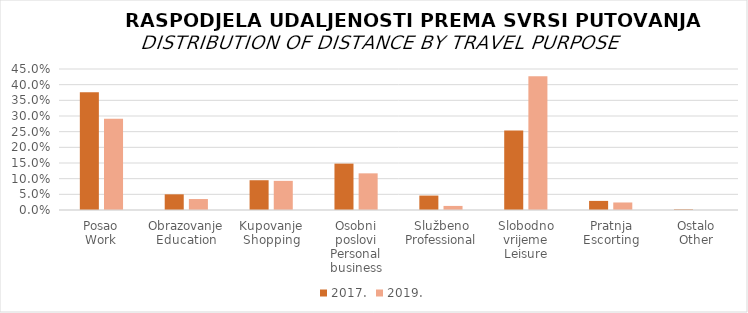
| Category | 2017. | 2019. |
|---|---|---|
| Posao
Work | 0.376 | 0.291 |
| Obrazovanje
Education | 0.05 | 0.035 |
| Kupovanje
Shopping | 0.095 | 0.093 |
| Osobni poslovi
Personal business | 0.148 | 0.117 |
| Službeno
Professional | 0.046 | 0.013 |
| Slobodno vrijeme
Leisure | 0.254 | 0.427 |
| Pratnja
Escorting | 0.029 | 0.024 |
| Ostalo
Other | 0.002 | 0 |